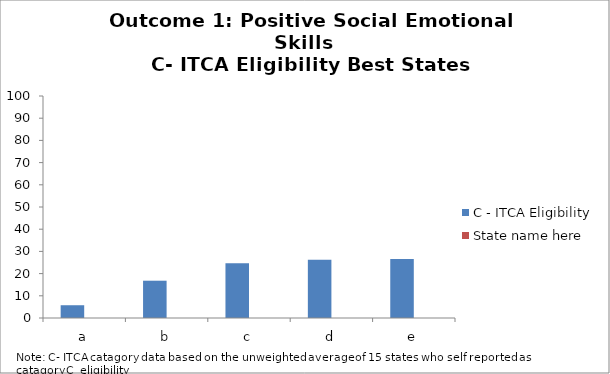
| Category | C - ITCA Eligibility | State name here |
|---|---|---|
| a | 5.75 |  |
| b | 16.8 |  |
| c | 24.7 |  |
| d | 26.2 |  |
| e | 26.6 |  |